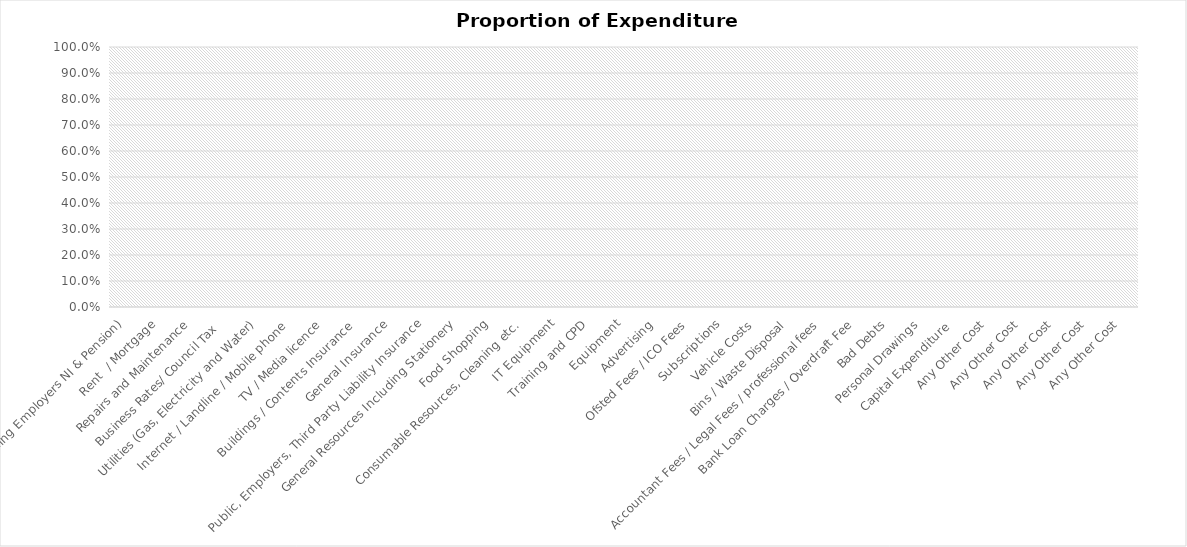
| Category | Series 0 |
|---|---|
| Salaries (including Employers NI & Pension) | 0 |
| Rent  / Mortgage | 0 |
| Repairs and Maintenance | 0 |
| Business Rates/ Council Tax  | 0 |
| Utilities (Gas, Electricity and Water) | 0 |
| Internet / Landline / Mobile phone  | 0 |
| TV / Media licence | 0 |
| Buildings / Contents Insurance  | 0 |
| General Insurance | 0 |
| Public, Employers, Third Party Liability Insurance | 0 |
| General Resources Including Stationery | 0 |
| Food Shopping | 0 |
| Consumable Resources, Cleaning etc. | 0 |
| IT Equipment | 0 |
| Training and CPD | 0 |
| Equipment | 0 |
| Advertising | 0 |
| Ofsted Fees / ICO Fees | 0 |
| Subscriptions | 0 |
| Vehicle Costs | 0 |
| Bins / Waste Disposal | 0 |
| Accountant Fees / Legal Fees / professional fees | 0 |
| Bank Loan Charges / Overdraft Fee | 0 |
| Bad Debts | 0 |
| Personal Drawings | 0 |
| Capital Expenditure  | 0 |
| Any Other Cost | 0 |
| Any Other Cost | 0 |
| Any Other Cost | 0 |
| Any Other Cost | 0 |
| Any Other Cost | 0 |